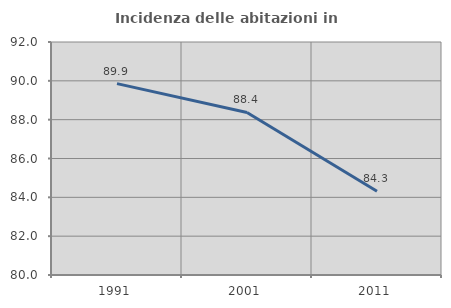
| Category | Incidenza delle abitazioni in proprietà  |
|---|---|
| 1991.0 | 89.855 |
| 2001.0 | 88.372 |
| 2011.0 | 84.314 |